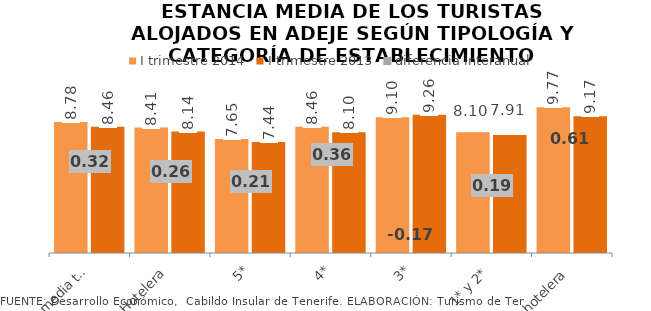
| Category | I trimestre 2014 | I trimestre 2013 |
|---|---|---|
| Estancia media total | 8.784 | 8.465 |
| Hotelera | 8.405 | 8.144 |
| 5* | 7.646 | 7.438 |
| 4* | 8.459 | 8.098 |
| 3* | 9.096 | 9.264 |
| 1* y 2* | 8.097 | 7.91 |
| Extrahotelera | 9.772 | 9.165 |